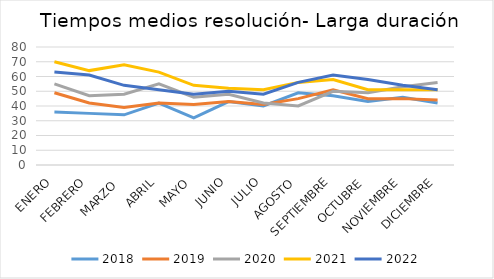
| Category | 2018 | 2019 | 2020 | 2021 | 2022 |
|---|---|---|---|---|---|
| ENERO | 36 | 49 | 55 | 70 | 63 |
| FEBRERO | 35 | 42 | 47 | 64 | 61 |
| MARZO  | 34 | 39 | 48 | 68 | 54 |
| ABRIL | 42 | 42 | 55 | 63 | 51 |
| MAYO | 32 | 41 | 46 | 54 | 48 |
| JUNIO | 43 | 43 | 48 | 52 | 50 |
| JULIO | 40 | 41 | 42 | 51 | 48 |
| AGOSTO | 49 | 45 | 40 | 56 | 56 |
| SEPTIEMBRE | 47 | 51 | 50 | 58 | 61 |
| OCTUBRE | 43 | 45 | 49 | 51 | 58 |
| NOVIEMBRE | 46 | 45 | 53 | 51 | 54 |
| DICIEMBRE | 42 | 44 | 56 | 51 | 51 |